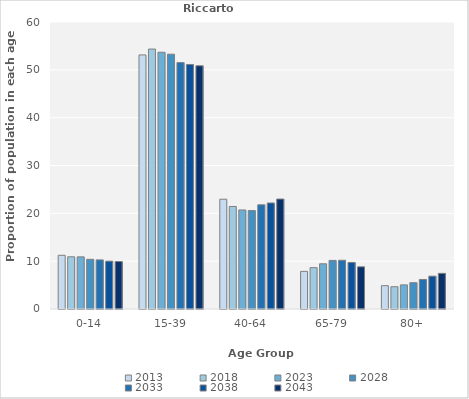
| Category | 2013 | 2018 | 2023 | 2028 | 2033 | 2038 | 2043 |
|---|---|---|---|---|---|---|---|
| 0-14 | 11.23 | 10.916 | 10.898 | 10.385 | 10.265 | 10 | 9.926 |
| 15-39 | 53.115 | 54.343 | 53.672 | 53.269 | 51.515 | 51.119 | 50.849 |
| 40-64 | 22.951 | 21.434 | 20.703 | 20.577 | 21.78 | 22.164 | 22.989 |
| 65-79 | 7.869 | 8.645 | 9.453 | 10.154 | 10.189 | 9.739 | 8.819 |
| 80+ | 4.877 | 4.661 | 5.039 | 5.5 | 6.174 | 6.866 | 7.454 |